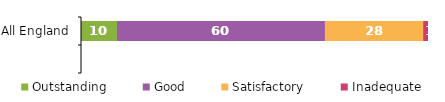
| Category | Outstanding | Good | Satisfactory | Inadequate |
|---|---|---|---|---|
| All England | 10.362 | 59.941 | 28.294 | 1.402 |